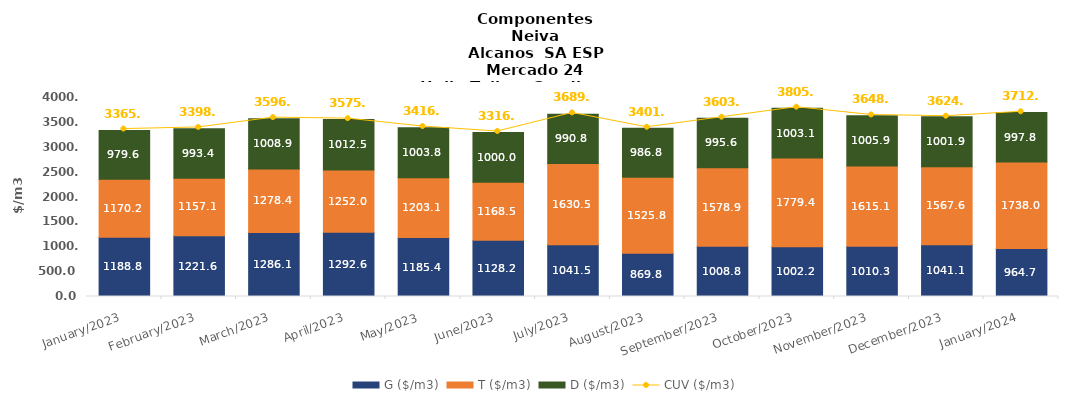
| Category | G ($/m3) | T ($/m3) | D ($/m3) |
|---|---|---|---|
| 2023-01-01 | 1188.81 | 1170.15 | 979.57 |
| 2023-02-01 | 1221.59 | 1157.08 | 993.4 |
| 2023-03-01 | 1286.09 | 1278.38 | 1008.86 |
| 2023-04-01 | 1292.6 | 1251.95 | 1012.48 |
| 2023-05-01 | 1185.42 | 1203.07 | 1003.78 |
| 2023-06-01 | 1128.21 | 1168.47 | 999.96 |
| 2023-07-01 | 1041.54 | 1630.51 | 990.77 |
| 2023-08-01 | 869.82 | 1525.81 | 986.78 |
| 2023-09-01 | 1008.82 | 1578.87 | 995.55 |
| 2023-10-01 | 1002.24 | 1779.41 | 1003.05 |
| 2023-11-01 | 1010.34 | 1615.11 | 1005.88 |
| 2023-12-01 | 1041.14 | 1567.6 | 1001.9 |
| 2024-01-01 | 964.66 | 1738.01 | 997.84 |